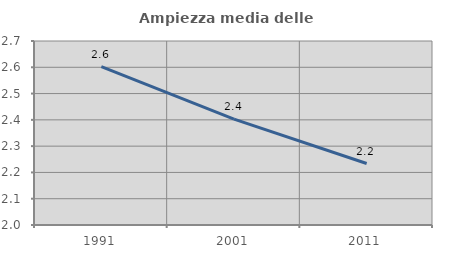
| Category | Ampiezza media delle famiglie |
|---|---|
| 1991.0 | 2.603 |
| 2001.0 | 2.403 |
| 2011.0 | 2.234 |